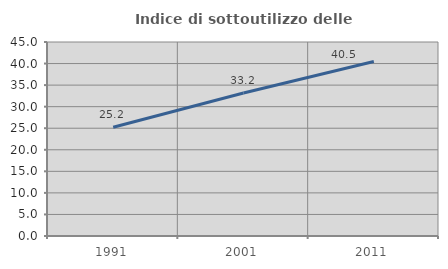
| Category | Indice di sottoutilizzo delle abitazioni  |
|---|---|
| 1991.0 | 25.209 |
| 2001.0 | 33.161 |
| 2011.0 | 40.483 |